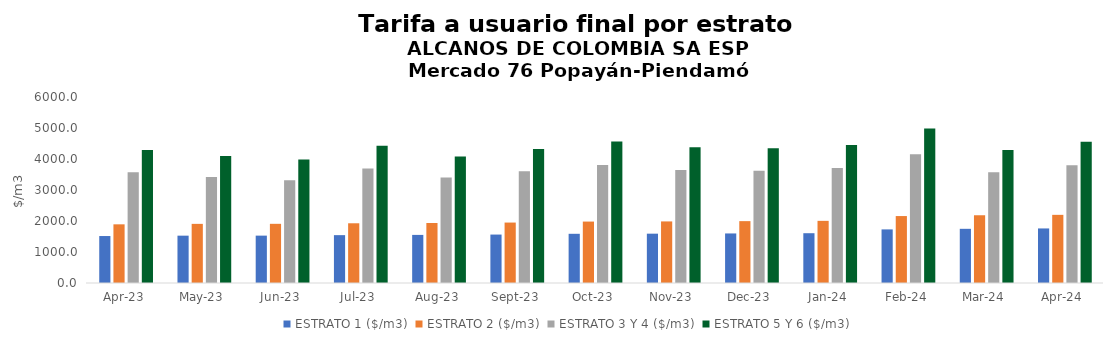
| Category | ESTRATO 1 ($/m3) | ESTRATO 2 ($/m3) | ESTRATO 3 Y 4 ($/m3) | ESTRATO 5 Y 6 ($/m3) |
|---|---|---|---|---|
| 2023-04-01 | 1515.22 | 1892.7 | 3575.22 | 4290.264 |
| 2023-05-01 | 1527.06 | 1907.55 | 3416.65 | 4099.98 |
| 2023-06-01 | 1528.08 | 1909 | 3316.57 | 3979.884 |
| 2023-07-01 | 1543.84 | 1926.61 | 3689.81 | 4427.772 |
| 2023-08-01 | 1551.43 | 1936.32 | 3401.48 | 4081.776 |
| 2023-09-01 | 1562.51 | 1949.77 | 3603.59 | 4324.308 |
| 2023-10-01 | 1587.1 | 1981.56 | 3805.44 | 4566.528 |
| 2023-11-01 | 1591.15 | 1986.35 | 3648.51 | 4378.212 |
| 2023-12-01 | 1598.38 | 1995.68 | 3624.28 | 4349.136 |
| 2024-01-01 | 1605.97 | 2004.9 | 3712.73 | 4455.276 |
| 2024-02-01 | 1728.92 | 2159.55 | 4149.96 | 4979.952 |
| 2024-03-01 | 1747.83 | 2183.07 | 3575.59 | 4290.708 |
| 2024-04-01 | 1760.05 | 2198.54 | 3795.47 | 4554.564 |